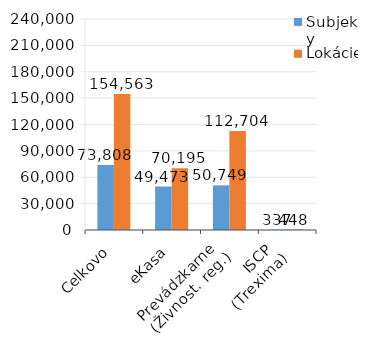
| Category | Subjekty | Lokácie |
|---|---|---|
| Celkovo | 73808 | 154563 |
| eKasa | 49473 | 70195 |
| Prevádzkarne 
(Živnost. reg.) | 50749 | 112704 |
| ISCP 
(Trexima) | 337 | 448 |